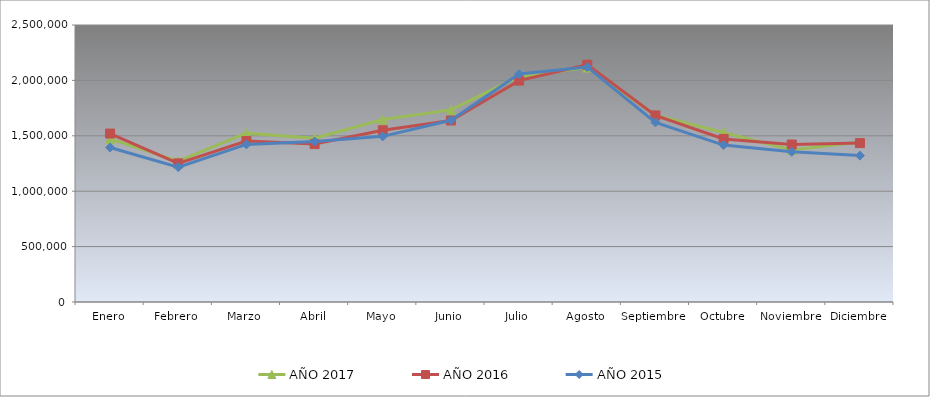
| Category | AÑO 2017 | AÑO 2016 | AÑO 2015 |
|---|---|---|---|
| Enero | 1472130 | 1520375 | 1394950 |
| Febrero | 1271355 | 1251175 | 1217630 |
| Marzo | 1524100 | 1453280 | 1422210 |
| Abril | 1477495 | 1425150 | 1448430 |
| Mayo | 1647200 | 1550270 | 1495040 |
| Junio | 1733985 | 1638000 | 1640250 |
| Julio | 2034480 | 1998270 | 2057070 |
| Agosto | 2115555 | 2141540 | 2120500 |
| Septiembre | 1686320 | 1684000 | 1621300 |
| Octubre | 1530050 | 1471810 | 1416460 |
| Noviembre | 1372680 | 1421240 | 1355360 |
| Diciembre | 1444430 | 1434310 | 1321190 |